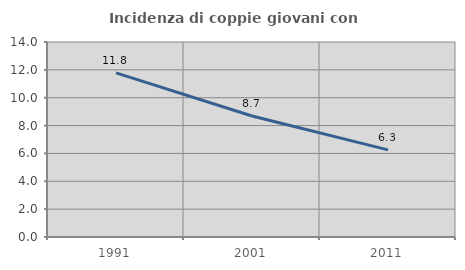
| Category | Incidenza di coppie giovani con figli |
|---|---|
| 1991.0 | 11.786 |
| 2001.0 | 8.689 |
| 2011.0 | 6.254 |